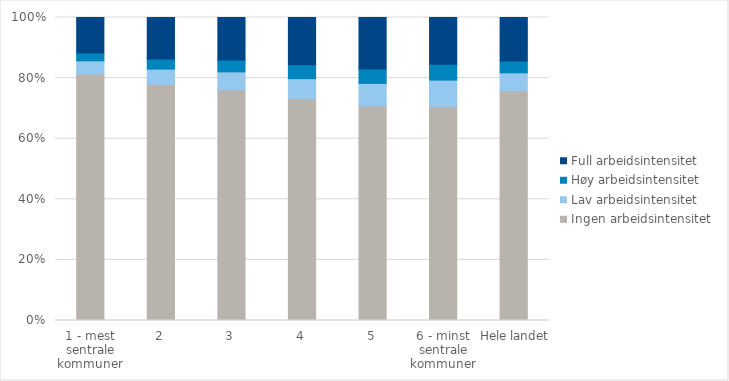
| Category | Ingen arbeidsintensitet | Lav arbeidsintensitet | Høy arbeidsintensitet | Full arbeidsintensitet |
|---|---|---|---|---|
| 1 - mest sentrale kommuner | 81.352 | 4.354 | 2.565 | 11.73 |
| 2 | 77.889 | 5.075 | 3.371 | 13.665 |
| 3 | 76.174 | 5.882 | 3.935 | 14.01 |
| 4 | 73.223 | 6.602 | 4.556 | 15.619 |
| 5 | 70.912 | 7.342 | 4.789 | 16.957 |
| 6 - minst sentrale kommuner | 70.647 | 8.688 | 5.227 | 15.438 |
| Hele landet | 75.778 | 5.953 | 3.916 | 14.353 |